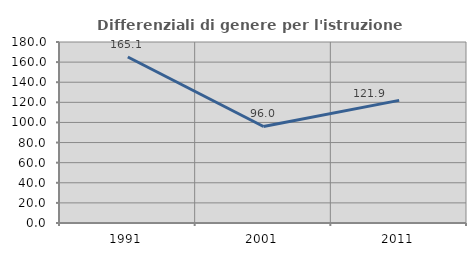
| Category | Differenziali di genere per l'istruzione superiore |
|---|---|
| 1991.0 | 165.103 |
| 2001.0 | 96 |
| 2011.0 | 121.934 |